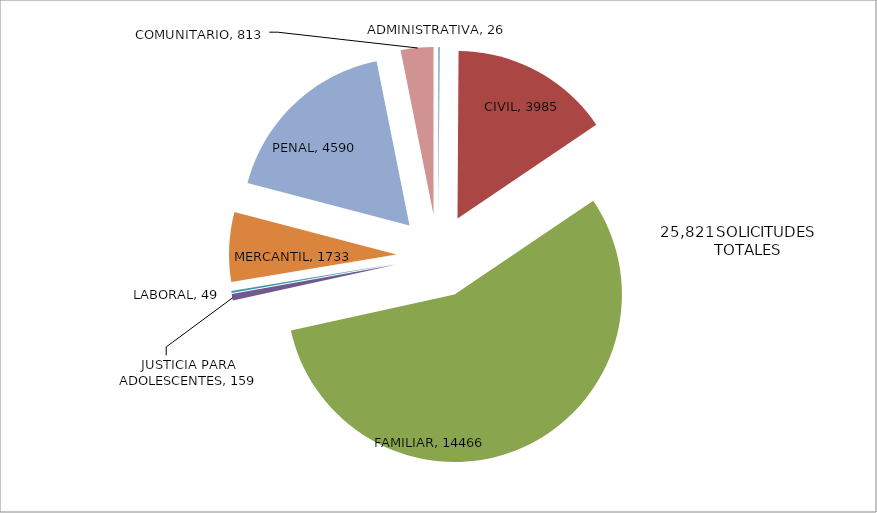
| Category | Series 0 |
|---|---|
| ADMINISTRATIVA | 26 |
| CIVIL | 3985 |
| FAMILIAR | 14466 |
| JUSTICIA PARA ADOLESCENTES | 159 |
| LABORAL | 49 |
| MERCANTIL | 1733 |
| PENAL | 4590 |
| COMUNITARIO | 813 |